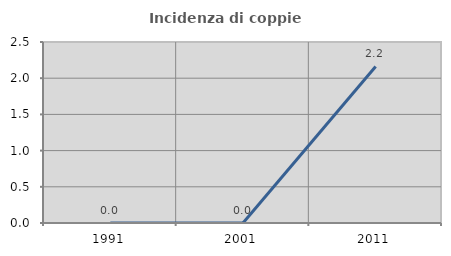
| Category | Incidenza di coppie miste |
|---|---|
| 1991.0 | 0 |
| 2001.0 | 0 |
| 2011.0 | 2.162 |